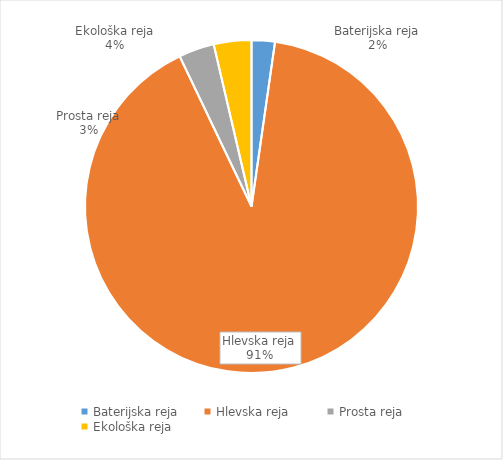
| Category | Količina kosov jajc |
|---|---|
| Baterijska reja | 73240 |
| Hlevska reja | 2933997 |
| Prosta reja | 111818 |
| Ekološka reja | 118100 |